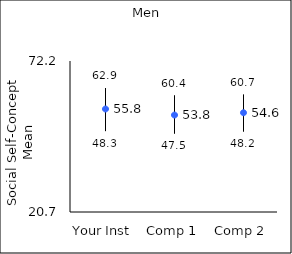
| Category | 25th percentile | 75th percentile | Mean |
|---|---|---|---|
| Your Inst | 48.3 | 62.9 | 55.83 |
| Comp 1 | 47.5 | 60.4 | 53.77 |
| Comp 2 | 48.2 | 60.7 | 54.56 |